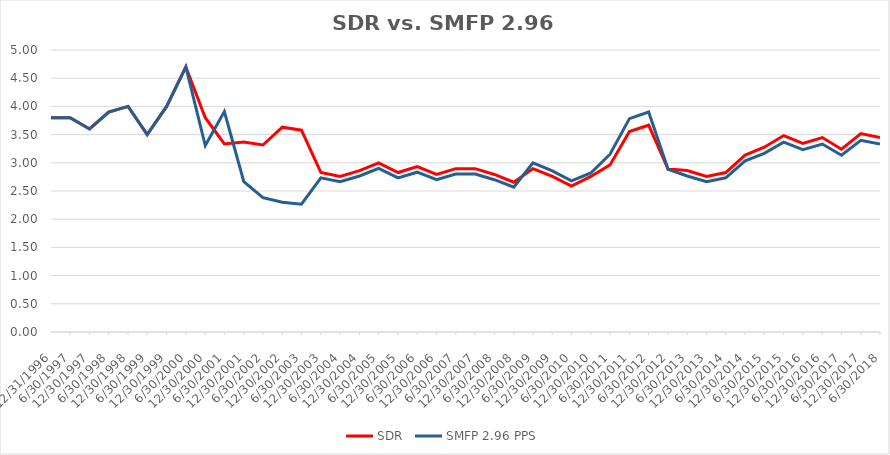
| Category | SDR | SMFP 2.96 PPS |
|---|---|---|
| 12/31/96 | 3.8 | 3.8 |
| 6/30/97 | 3.8 | 3.8 |
| 12/31/97 | 3.6 | 3.6 |
| 6/30/98 | 3.9 | 3.9 |
| 12/31/98 | 4 | 4 |
| 6/30/99 | 3.5 | 3.5 |
| 12/31/99 | 4 | 4 |
| 6/30/00 | 4.7 | 4.7 |
| 12/31/00 | 3.8 | 3.306 |
| 6/30/01 | 3.333 | 3.907 |
| 12/31/01 | 3.368 | 2.665 |
| 6/30/02 | 3.316 | 2.381 |
| 12/31/02 | 3.632 | 2.3 |
| 6/30/03 | 3.579 | 2.267 |
| 12/31/03 | 2.828 | 2.733 |
| 6/30/04 | 2.759 | 2.667 |
| 12/31/04 | 2.862 | 2.767 |
| 6/30/05 | 3 | 2.9 |
| 12/31/05 | 2.828 | 2.733 |
| 6/30/06 | 2.931 | 2.833 |
| 12/31/06 | 2.793 | 2.7 |
| 6/30/07 | 2.897 | 2.8 |
| 12/31/07 | 2.897 | 2.8 |
| 6/30/08 | 2.793 | 2.7 |
| 12/31/08 | 2.655 | 2.567 |
| 6/30/09 | 2.897 | 3 |
| 12/31/09 | 2.759 | 2.857 |
| 6/30/10 | 2.586 | 2.679 |
| 12/31/10 | 2.759 | 2.819 |
| 6/30/11 | 2.963 | 3.152 |
| 12/31/11 | 3.556 | 3.783 |
| 6/30/12 | 3.667 | 3.901 |
| 12/31/12 | 2.889 | 2.886 |
| 6/30/13 | 2.862 | 2.767 |
| 12/31/13 | 2.759 | 2.667 |
| 6/30/14 | 2.828 | 2.733 |
| 12/31/14 | 3.138 | 3.033 |
| 6/30/15 | 3.276 | 3.167 |
| 12/31/15 | 3.483 | 3.367 |
| 6/30/16 | 3.345 | 3.233 |
| 12/31/16 | 3.448 | 3.333 |
| 6/30/17 | 3.241 | 3.133 |
| 12/31/17 | 3.517 | 3.4 |
| 6/30/18 | 3.448 | 3.333 |